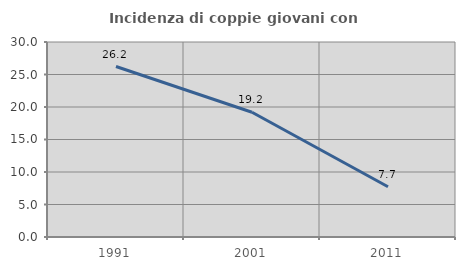
| Category | Incidenza di coppie giovani con figli |
|---|---|
| 1991.0 | 26.23 |
| 2001.0 | 19.196 |
| 2011.0 | 7.729 |